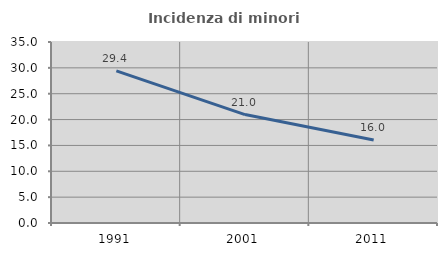
| Category | Incidenza di minori stranieri |
|---|---|
| 1991.0 | 29.412 |
| 2001.0 | 20.968 |
| 2011.0 | 16.04 |